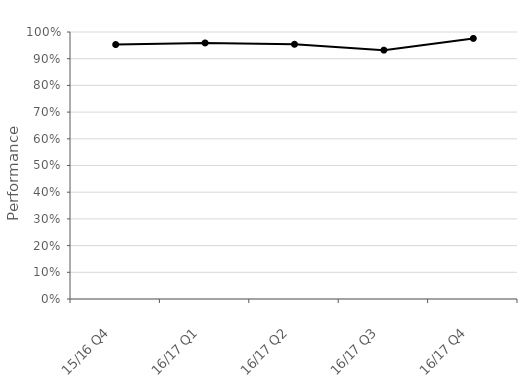
| Category | National |
|---|---|
| 15/16 Q4 | 0.953 |
| 16/17 Q1 | 0.959 |
| 16/17 Q2 | 0.954 |
| 16/17 Q3 | 0.932 |
| 16/17 Q4 | 0.976 |